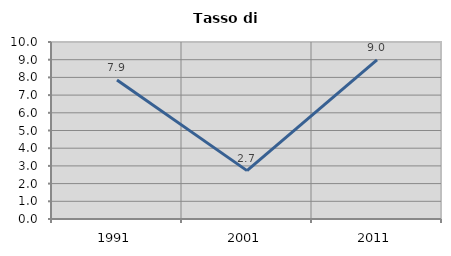
| Category | Tasso di disoccupazione   |
|---|---|
| 1991.0 | 7.853 |
| 2001.0 | 2.732 |
| 2011.0 | 8.989 |